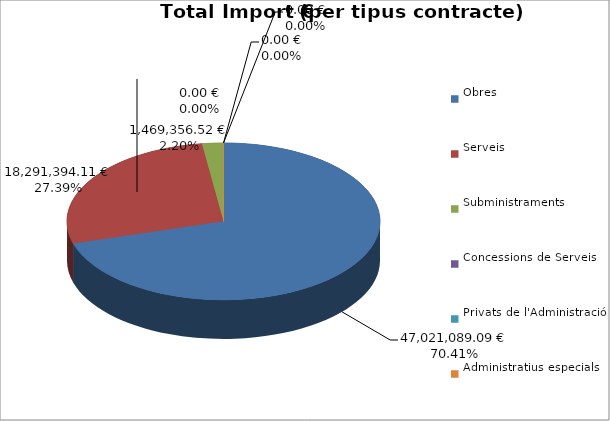
| Category | Total preu
(amb IVA) |
|---|---|
| Obres | 47021089.087 |
| Serveis | 18291394.113 |
| Subministraments | 1469356.516 |
| Concessions de Serveis | 0 |
| Privats de l'Administració | 0 |
| Administratius especials | 0 |